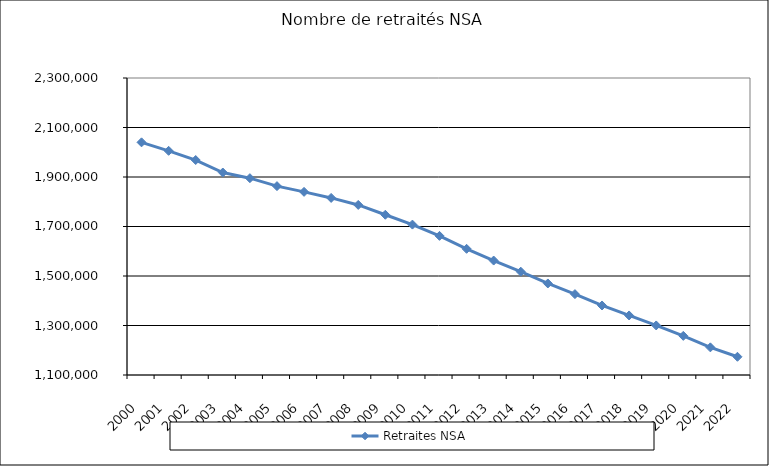
| Category | Retraites NSA |
|---|---|
| 2000.0 | 2040033 |
| 2001.0 | 2005802 |
| 2002.0 | 1968606 |
| 2003.0 | 1918080 |
| 2004.0 | 1895279 |
| 2005.0 | 1863109 |
| 2006.0 | 1839904 |
| 2007.0 | 1815507 |
| 2008.0 | 1787171 |
| 2009.0 | 1747453 |
| 2010.0 | 1707668 |
| 2011.0 | 1662131 |
| 2012.0 | 1609842 |
| 2013.0 | 1562430 |
| 2014.0 | 1517389 |
| 2015.0 | 1469844 |
| 2016.0 | 1426811 |
| 2017.0 | 1380904 |
| 2018.0 | 1340581 |
| 2019.0 | 1300239 |
| 2020.0 | 1258098 |
| 2021.0 | 1211645 |
| 2022.0 | 1173608 |